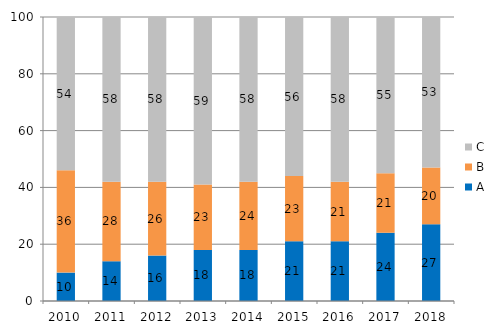
| Category | A | B | C |
|---|---|---|---|
| 2010.0 | 10 | 36 | 54 |
| 2011.0 | 14 | 28 | 58 |
| 2012.0 | 16 | 26 | 58 |
| 2013.0 | 18 | 23 | 59 |
| 2014.0 | 18 | 24 | 58 |
| 2015.0 | 21 | 23 | 56 |
| 2016.0 | 21 | 21 | 58 |
| 2017.0 | 24 | 21 | 55 |
| 2018.0 | 27 | 20 | 53 |